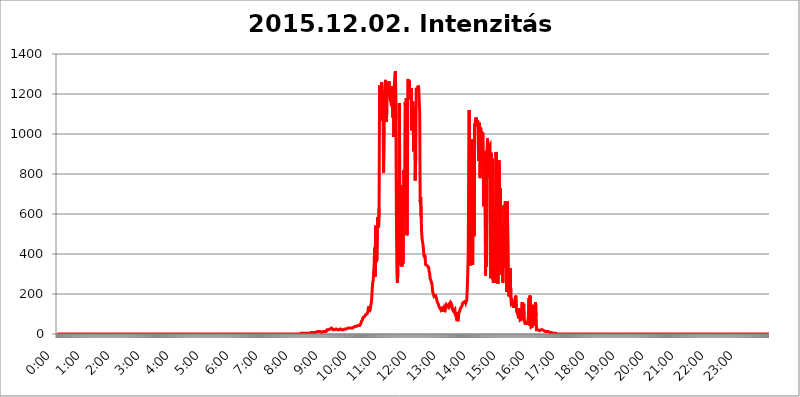
| Category | 2015.12.02. Intenzitás [W/m^2] |
|---|---|
| 0.0 | 0 |
| 0.0006944444444444445 | 0 |
| 0.001388888888888889 | 0 |
| 0.0020833333333333333 | 0 |
| 0.002777777777777778 | 0 |
| 0.003472222222222222 | 0 |
| 0.004166666666666667 | 0 |
| 0.004861111111111111 | 0 |
| 0.005555555555555556 | 0 |
| 0.0062499999999999995 | 0 |
| 0.006944444444444444 | 0 |
| 0.007638888888888889 | 0 |
| 0.008333333333333333 | 0 |
| 0.009027777777777779 | 0 |
| 0.009722222222222222 | 0 |
| 0.010416666666666666 | 0 |
| 0.011111111111111112 | 0 |
| 0.011805555555555555 | 0 |
| 0.012499999999999999 | 0 |
| 0.013194444444444444 | 0 |
| 0.013888888888888888 | 0 |
| 0.014583333333333332 | 0 |
| 0.015277777777777777 | 0 |
| 0.015972222222222224 | 0 |
| 0.016666666666666666 | 0 |
| 0.017361111111111112 | 0 |
| 0.018055555555555557 | 0 |
| 0.01875 | 0 |
| 0.019444444444444445 | 0 |
| 0.02013888888888889 | 0 |
| 0.020833333333333332 | 0 |
| 0.02152777777777778 | 0 |
| 0.022222222222222223 | 0 |
| 0.02291666666666667 | 0 |
| 0.02361111111111111 | 0 |
| 0.024305555555555556 | 0 |
| 0.024999999999999998 | 0 |
| 0.025694444444444447 | 0 |
| 0.02638888888888889 | 0 |
| 0.027083333333333334 | 0 |
| 0.027777777777777776 | 0 |
| 0.02847222222222222 | 0 |
| 0.029166666666666664 | 0 |
| 0.029861111111111113 | 0 |
| 0.030555555555555555 | 0 |
| 0.03125 | 0 |
| 0.03194444444444445 | 0 |
| 0.03263888888888889 | 0 |
| 0.03333333333333333 | 0 |
| 0.034027777777777775 | 0 |
| 0.034722222222222224 | 0 |
| 0.035416666666666666 | 0 |
| 0.036111111111111115 | 0 |
| 0.03680555555555556 | 0 |
| 0.0375 | 0 |
| 0.03819444444444444 | 0 |
| 0.03888888888888889 | 0 |
| 0.03958333333333333 | 0 |
| 0.04027777777777778 | 0 |
| 0.04097222222222222 | 0 |
| 0.041666666666666664 | 0 |
| 0.042361111111111106 | 0 |
| 0.04305555555555556 | 0 |
| 0.043750000000000004 | 0 |
| 0.044444444444444446 | 0 |
| 0.04513888888888889 | 0 |
| 0.04583333333333334 | 0 |
| 0.04652777777777778 | 0 |
| 0.04722222222222222 | 0 |
| 0.04791666666666666 | 0 |
| 0.04861111111111111 | 0 |
| 0.049305555555555554 | 0 |
| 0.049999999999999996 | 0 |
| 0.05069444444444445 | 0 |
| 0.051388888888888894 | 0 |
| 0.052083333333333336 | 0 |
| 0.05277777777777778 | 0 |
| 0.05347222222222222 | 0 |
| 0.05416666666666667 | 0 |
| 0.05486111111111111 | 0 |
| 0.05555555555555555 | 0 |
| 0.05625 | 0 |
| 0.05694444444444444 | 0 |
| 0.057638888888888885 | 0 |
| 0.05833333333333333 | 0 |
| 0.05902777777777778 | 0 |
| 0.059722222222222225 | 0 |
| 0.06041666666666667 | 0 |
| 0.061111111111111116 | 0 |
| 0.06180555555555556 | 0 |
| 0.0625 | 0 |
| 0.06319444444444444 | 0 |
| 0.06388888888888888 | 0 |
| 0.06458333333333334 | 0 |
| 0.06527777777777778 | 0 |
| 0.06597222222222222 | 0 |
| 0.06666666666666667 | 0 |
| 0.06736111111111111 | 0 |
| 0.06805555555555555 | 0 |
| 0.06874999999999999 | 0 |
| 0.06944444444444443 | 0 |
| 0.07013888888888889 | 0 |
| 0.07083333333333333 | 0 |
| 0.07152777777777779 | 0 |
| 0.07222222222222223 | 0 |
| 0.07291666666666667 | 0 |
| 0.07361111111111111 | 0 |
| 0.07430555555555556 | 0 |
| 0.075 | 0 |
| 0.07569444444444444 | 0 |
| 0.0763888888888889 | 0 |
| 0.07708333333333334 | 0 |
| 0.07777777777777778 | 0 |
| 0.07847222222222222 | 0 |
| 0.07916666666666666 | 0 |
| 0.0798611111111111 | 0 |
| 0.08055555555555556 | 0 |
| 0.08125 | 0 |
| 0.08194444444444444 | 0 |
| 0.08263888888888889 | 0 |
| 0.08333333333333333 | 0 |
| 0.08402777777777777 | 0 |
| 0.08472222222222221 | 0 |
| 0.08541666666666665 | 0 |
| 0.08611111111111112 | 0 |
| 0.08680555555555557 | 0 |
| 0.08750000000000001 | 0 |
| 0.08819444444444445 | 0 |
| 0.08888888888888889 | 0 |
| 0.08958333333333333 | 0 |
| 0.09027777777777778 | 0 |
| 0.09097222222222222 | 0 |
| 0.09166666666666667 | 0 |
| 0.09236111111111112 | 0 |
| 0.09305555555555556 | 0 |
| 0.09375 | 0 |
| 0.09444444444444444 | 0 |
| 0.09513888888888888 | 0 |
| 0.09583333333333333 | 0 |
| 0.09652777777777777 | 0 |
| 0.09722222222222222 | 0 |
| 0.09791666666666667 | 0 |
| 0.09861111111111111 | 0 |
| 0.09930555555555555 | 0 |
| 0.09999999999999999 | 0 |
| 0.10069444444444443 | 0 |
| 0.1013888888888889 | 0 |
| 0.10208333333333335 | 0 |
| 0.10277777777777779 | 0 |
| 0.10347222222222223 | 0 |
| 0.10416666666666667 | 0 |
| 0.10486111111111111 | 0 |
| 0.10555555555555556 | 0 |
| 0.10625 | 0 |
| 0.10694444444444444 | 0 |
| 0.1076388888888889 | 0 |
| 0.10833333333333334 | 0 |
| 0.10902777777777778 | 0 |
| 0.10972222222222222 | 0 |
| 0.1111111111111111 | 0 |
| 0.11180555555555556 | 0 |
| 0.11180555555555556 | 0 |
| 0.1125 | 0 |
| 0.11319444444444444 | 0 |
| 0.11388888888888889 | 0 |
| 0.11458333333333333 | 0 |
| 0.11527777777777777 | 0 |
| 0.11597222222222221 | 0 |
| 0.11666666666666665 | 0 |
| 0.1173611111111111 | 0 |
| 0.11805555555555557 | 0 |
| 0.11944444444444445 | 0 |
| 0.12013888888888889 | 0 |
| 0.12083333333333333 | 0 |
| 0.12152777777777778 | 0 |
| 0.12222222222222223 | 0 |
| 0.12291666666666667 | 0 |
| 0.12291666666666667 | 0 |
| 0.12361111111111112 | 0 |
| 0.12430555555555556 | 0 |
| 0.125 | 0 |
| 0.12569444444444444 | 0 |
| 0.12638888888888888 | 0 |
| 0.12708333333333333 | 0 |
| 0.16875 | 0 |
| 0.12847222222222224 | 0 |
| 0.12916666666666668 | 0 |
| 0.12986111111111112 | 0 |
| 0.13055555555555556 | 0 |
| 0.13125 | 0 |
| 0.13194444444444445 | 0 |
| 0.1326388888888889 | 0 |
| 0.13333333333333333 | 0 |
| 0.13402777777777777 | 0 |
| 0.13402777777777777 | 0 |
| 0.13472222222222222 | 0 |
| 0.13541666666666666 | 0 |
| 0.1361111111111111 | 0 |
| 0.13749999999999998 | 0 |
| 0.13819444444444443 | 0 |
| 0.1388888888888889 | 0 |
| 0.13958333333333334 | 0 |
| 0.14027777777777778 | 0 |
| 0.14097222222222222 | 0 |
| 0.14166666666666666 | 0 |
| 0.1423611111111111 | 0 |
| 0.14305555555555557 | 0 |
| 0.14375000000000002 | 0 |
| 0.14444444444444446 | 0 |
| 0.1451388888888889 | 0 |
| 0.1451388888888889 | 0 |
| 0.14652777777777778 | 0 |
| 0.14722222222222223 | 0 |
| 0.14791666666666667 | 0 |
| 0.1486111111111111 | 0 |
| 0.14930555555555555 | 0 |
| 0.15 | 0 |
| 0.15069444444444444 | 0 |
| 0.15138888888888888 | 0 |
| 0.15208333333333332 | 0 |
| 0.15277777777777776 | 0 |
| 0.15347222222222223 | 0 |
| 0.15416666666666667 | 0 |
| 0.15486111111111112 | 0 |
| 0.15555555555555556 | 0 |
| 0.15625 | 0 |
| 0.15694444444444444 | 0 |
| 0.15763888888888888 | 0 |
| 0.15833333333333333 | 0 |
| 0.15902777777777777 | 0 |
| 0.15972222222222224 | 0 |
| 0.16041666666666668 | 0 |
| 0.16111111111111112 | 0 |
| 0.16180555555555556 | 0 |
| 0.1625 | 0 |
| 0.16319444444444445 | 0 |
| 0.1638888888888889 | 0 |
| 0.16458333333333333 | 0 |
| 0.16527777777777777 | 0 |
| 0.16597222222222222 | 0 |
| 0.16666666666666666 | 0 |
| 0.1673611111111111 | 0 |
| 0.16805555555555554 | 0 |
| 0.16874999999999998 | 0 |
| 0.16944444444444443 | 0 |
| 0.17013888888888887 | 0 |
| 0.1708333333333333 | 0 |
| 0.17152777777777775 | 0 |
| 0.17222222222222225 | 0 |
| 0.1729166666666667 | 0 |
| 0.17361111111111113 | 0 |
| 0.17430555555555557 | 0 |
| 0.17500000000000002 | 0 |
| 0.17569444444444446 | 0 |
| 0.1763888888888889 | 0 |
| 0.17708333333333334 | 0 |
| 0.17777777777777778 | 0 |
| 0.17847222222222223 | 0 |
| 0.17916666666666667 | 0 |
| 0.1798611111111111 | 0 |
| 0.18055555555555555 | 0 |
| 0.18125 | 0 |
| 0.18194444444444444 | 0 |
| 0.1826388888888889 | 0 |
| 0.18333333333333335 | 0 |
| 0.1840277777777778 | 0 |
| 0.18472222222222223 | 0 |
| 0.18541666666666667 | 0 |
| 0.18611111111111112 | 0 |
| 0.18680555555555556 | 0 |
| 0.1875 | 0 |
| 0.18819444444444444 | 0 |
| 0.18888888888888888 | 0 |
| 0.18958333333333333 | 0 |
| 0.19027777777777777 | 0 |
| 0.1909722222222222 | 0 |
| 0.19166666666666665 | 0 |
| 0.19236111111111112 | 0 |
| 0.19305555555555554 | 0 |
| 0.19375 | 0 |
| 0.19444444444444445 | 0 |
| 0.1951388888888889 | 0 |
| 0.19583333333333333 | 0 |
| 0.19652777777777777 | 0 |
| 0.19722222222222222 | 0 |
| 0.19791666666666666 | 0 |
| 0.1986111111111111 | 0 |
| 0.19930555555555554 | 0 |
| 0.19999999999999998 | 0 |
| 0.20069444444444443 | 0 |
| 0.20138888888888887 | 0 |
| 0.2020833333333333 | 0 |
| 0.2027777777777778 | 0 |
| 0.2034722222222222 | 0 |
| 0.2041666666666667 | 0 |
| 0.20486111111111113 | 0 |
| 0.20555555555555557 | 0 |
| 0.20625000000000002 | 0 |
| 0.20694444444444446 | 0 |
| 0.2076388888888889 | 0 |
| 0.20833333333333334 | 0 |
| 0.20902777777777778 | 0 |
| 0.20972222222222223 | 0 |
| 0.21041666666666667 | 0 |
| 0.2111111111111111 | 0 |
| 0.21180555555555555 | 0 |
| 0.2125 | 0 |
| 0.21319444444444444 | 0 |
| 0.2138888888888889 | 0 |
| 0.21458333333333335 | 0 |
| 0.2152777777777778 | 0 |
| 0.21597222222222223 | 0 |
| 0.21666666666666667 | 0 |
| 0.21736111111111112 | 0 |
| 0.21805555555555556 | 0 |
| 0.21875 | 0 |
| 0.21944444444444444 | 0 |
| 0.22013888888888888 | 0 |
| 0.22083333333333333 | 0 |
| 0.22152777777777777 | 0 |
| 0.2222222222222222 | 0 |
| 0.22291666666666665 | 0 |
| 0.2236111111111111 | 0 |
| 0.22430555555555556 | 0 |
| 0.225 | 0 |
| 0.22569444444444445 | 0 |
| 0.2263888888888889 | 0 |
| 0.22708333333333333 | 0 |
| 0.22777777777777777 | 0 |
| 0.22847222222222222 | 0 |
| 0.22916666666666666 | 0 |
| 0.2298611111111111 | 0 |
| 0.23055555555555554 | 0 |
| 0.23124999999999998 | 0 |
| 0.23194444444444443 | 0 |
| 0.23263888888888887 | 0 |
| 0.2333333333333333 | 0 |
| 0.2340277777777778 | 0 |
| 0.2347222222222222 | 0 |
| 0.2354166666666667 | 0 |
| 0.23611111111111113 | 0 |
| 0.23680555555555557 | 0 |
| 0.23750000000000002 | 0 |
| 0.23819444444444446 | 0 |
| 0.2388888888888889 | 0 |
| 0.23958333333333334 | 0 |
| 0.24027777777777778 | 0 |
| 0.24097222222222223 | 0 |
| 0.24166666666666667 | 0 |
| 0.2423611111111111 | 0 |
| 0.24305555555555555 | 0 |
| 0.24375 | 0 |
| 0.24444444444444446 | 0 |
| 0.24513888888888888 | 0 |
| 0.24583333333333335 | 0 |
| 0.2465277777777778 | 0 |
| 0.24722222222222223 | 0 |
| 0.24791666666666667 | 0 |
| 0.24861111111111112 | 0 |
| 0.24930555555555556 | 0 |
| 0.25 | 0 |
| 0.25069444444444444 | 0 |
| 0.2513888888888889 | 0 |
| 0.2520833333333333 | 0 |
| 0.25277777777777777 | 0 |
| 0.2534722222222222 | 0 |
| 0.25416666666666665 | 0 |
| 0.2548611111111111 | 0 |
| 0.2555555555555556 | 0 |
| 0.25625000000000003 | 0 |
| 0.2569444444444445 | 0 |
| 0.2576388888888889 | 0 |
| 0.25833333333333336 | 0 |
| 0.2590277777777778 | 0 |
| 0.25972222222222224 | 0 |
| 0.2604166666666667 | 0 |
| 0.2611111111111111 | 0 |
| 0.26180555555555557 | 0 |
| 0.2625 | 0 |
| 0.26319444444444445 | 0 |
| 0.2638888888888889 | 0 |
| 0.26458333333333334 | 0 |
| 0.2652777777777778 | 0 |
| 0.2659722222222222 | 0 |
| 0.26666666666666666 | 0 |
| 0.2673611111111111 | 0 |
| 0.26805555555555555 | 0 |
| 0.26875 | 0 |
| 0.26944444444444443 | 0 |
| 0.2701388888888889 | 0 |
| 0.2708333333333333 | 0 |
| 0.27152777777777776 | 0 |
| 0.2722222222222222 | 0 |
| 0.27291666666666664 | 0 |
| 0.2736111111111111 | 0 |
| 0.2743055555555555 | 0 |
| 0.27499999999999997 | 0 |
| 0.27569444444444446 | 0 |
| 0.27638888888888885 | 0 |
| 0.27708333333333335 | 0 |
| 0.2777777777777778 | 0 |
| 0.27847222222222223 | 0 |
| 0.2791666666666667 | 0 |
| 0.2798611111111111 | 0 |
| 0.28055555555555556 | 0 |
| 0.28125 | 0 |
| 0.28194444444444444 | 0 |
| 0.2826388888888889 | 0 |
| 0.2833333333333333 | 0 |
| 0.28402777777777777 | 0 |
| 0.2847222222222222 | 0 |
| 0.28541666666666665 | 0 |
| 0.28611111111111115 | 0 |
| 0.28680555555555554 | 0 |
| 0.28750000000000003 | 0 |
| 0.2881944444444445 | 0 |
| 0.2888888888888889 | 0 |
| 0.28958333333333336 | 0 |
| 0.2902777777777778 | 0 |
| 0.29097222222222224 | 0 |
| 0.2916666666666667 | 0 |
| 0.2923611111111111 | 0 |
| 0.29305555555555557 | 0 |
| 0.29375 | 0 |
| 0.29444444444444445 | 0 |
| 0.2951388888888889 | 0 |
| 0.29583333333333334 | 0 |
| 0.2965277777777778 | 0 |
| 0.2972222222222222 | 0 |
| 0.29791666666666666 | 0 |
| 0.2986111111111111 | 0 |
| 0.29930555555555555 | 0 |
| 0.3 | 0 |
| 0.30069444444444443 | 0 |
| 0.3013888888888889 | 0 |
| 0.3020833333333333 | 0 |
| 0.30277777777777776 | 0 |
| 0.3034722222222222 | 0 |
| 0.30416666666666664 | 0 |
| 0.3048611111111111 | 0 |
| 0.3055555555555555 | 0 |
| 0.30624999999999997 | 0 |
| 0.3069444444444444 | 0 |
| 0.3076388888888889 | 0 |
| 0.30833333333333335 | 0 |
| 0.3090277777777778 | 0 |
| 0.30972222222222223 | 0 |
| 0.3104166666666667 | 0 |
| 0.3111111111111111 | 0 |
| 0.31180555555555556 | 0 |
| 0.3125 | 0 |
| 0.31319444444444444 | 0 |
| 0.3138888888888889 | 0 |
| 0.3145833333333333 | 0 |
| 0.31527777777777777 | 0 |
| 0.3159722222222222 | 0 |
| 0.31666666666666665 | 0 |
| 0.31736111111111115 | 0 |
| 0.31805555555555554 | 0 |
| 0.31875000000000003 | 0 |
| 0.3194444444444445 | 0 |
| 0.3201388888888889 | 0 |
| 0.32083333333333336 | 0 |
| 0.3215277777777778 | 0 |
| 0.32222222222222224 | 0 |
| 0.3229166666666667 | 0 |
| 0.3236111111111111 | 0 |
| 0.32430555555555557 | 0 |
| 0.325 | 0 |
| 0.32569444444444445 | 0 |
| 0.3263888888888889 | 0 |
| 0.32708333333333334 | 0 |
| 0.3277777777777778 | 0 |
| 0.3284722222222222 | 0 |
| 0.32916666666666666 | 0 |
| 0.3298611111111111 | 0 |
| 0.33055555555555555 | 0 |
| 0.33125 | 0 |
| 0.33194444444444443 | 0 |
| 0.3326388888888889 | 0 |
| 0.3333333333333333 | 0 |
| 0.3340277777777778 | 0 |
| 0.3347222222222222 | 0 |
| 0.3354166666666667 | 0 |
| 0.3361111111111111 | 0 |
| 0.3368055555555556 | 0 |
| 0.33749999999999997 | 0 |
| 0.33819444444444446 | 0 |
| 0.33888888888888885 | 0 |
| 0.33958333333333335 | 0 |
| 0.34027777777777773 | 3.525 |
| 0.34097222222222223 | 0 |
| 0.3416666666666666 | 3.525 |
| 0.3423611111111111 | 0 |
| 0.3430555555555555 | 0 |
| 0.34375 | 3.525 |
| 0.3444444444444445 | 3.525 |
| 0.3451388888888889 | 3.525 |
| 0.3458333333333334 | 3.525 |
| 0.34652777777777777 | 3.525 |
| 0.34722222222222227 | 3.525 |
| 0.34791666666666665 | 3.525 |
| 0.34861111111111115 | 3.525 |
| 0.34930555555555554 | 3.525 |
| 0.35000000000000003 | 3.525 |
| 0.3506944444444444 | 3.525 |
| 0.3513888888888889 | 3.525 |
| 0.3520833333333333 | 3.525 |
| 0.3527777777777778 | 3.525 |
| 0.3534722222222222 | 3.525 |
| 0.3541666666666667 | 3.525 |
| 0.3548611111111111 | 3.525 |
| 0.35555555555555557 | 7.887 |
| 0.35625 | 7.887 |
| 0.35694444444444445 | 7.887 |
| 0.3576388888888889 | 7.887 |
| 0.35833333333333334 | 7.887 |
| 0.3590277777777778 | 7.887 |
| 0.3597222222222222 | 7.887 |
| 0.36041666666666666 | 7.887 |
| 0.3611111111111111 | 7.887 |
| 0.36180555555555555 | 7.887 |
| 0.3625 | 7.887 |
| 0.36319444444444443 | 7.887 |
| 0.3638888888888889 | 7.887 |
| 0.3645833333333333 | 12.257 |
| 0.3652777777777778 | 12.257 |
| 0.3659722222222222 | 12.257 |
| 0.3666666666666667 | 12.257 |
| 0.3673611111111111 | 12.257 |
| 0.3680555555555556 | 12.257 |
| 0.36874999999999997 | 12.257 |
| 0.36944444444444446 | 12.257 |
| 0.37013888888888885 | 12.257 |
| 0.37083333333333335 | 7.887 |
| 0.37152777777777773 | 12.257 |
| 0.37222222222222223 | 12.257 |
| 0.3729166666666666 | 12.257 |
| 0.3736111111111111 | 12.257 |
| 0.3743055555555555 | 12.257 |
| 0.375 | 12.257 |
| 0.3756944444444445 | 12.257 |
| 0.3763888888888889 | 12.257 |
| 0.3770833333333334 | 12.257 |
| 0.37777777777777777 | 16.636 |
| 0.37847222222222227 | 21.024 |
| 0.37916666666666665 | 21.024 |
| 0.37986111111111115 | 21.024 |
| 0.38055555555555554 | 21.024 |
| 0.38125000000000003 | 21.024 |
| 0.3819444444444444 | 21.024 |
| 0.3826388888888889 | 25.419 |
| 0.3833333333333333 | 25.419 |
| 0.3840277777777778 | 29.823 |
| 0.3847222222222222 | 29.823 |
| 0.3854166666666667 | 25.419 |
| 0.3861111111111111 | 25.419 |
| 0.38680555555555557 | 21.024 |
| 0.3875 | 21.024 |
| 0.38819444444444445 | 21.024 |
| 0.3888888888888889 | 21.024 |
| 0.38958333333333334 | 25.419 |
| 0.3902777777777778 | 25.419 |
| 0.3909722222222222 | 25.419 |
| 0.39166666666666666 | 21.024 |
| 0.3923611111111111 | 21.024 |
| 0.39305555555555555 | 21.024 |
| 0.39375 | 21.024 |
| 0.39444444444444443 | 21.024 |
| 0.3951388888888889 | 21.024 |
| 0.3958333333333333 | 25.419 |
| 0.3965277777777778 | 25.419 |
| 0.3972222222222222 | 25.419 |
| 0.3979166666666667 | 25.419 |
| 0.3986111111111111 | 21.024 |
| 0.3993055555555556 | 21.024 |
| 0.39999999999999997 | 21.024 |
| 0.40069444444444446 | 21.024 |
| 0.40138888888888885 | 21.024 |
| 0.40208333333333335 | 25.419 |
| 0.40277777777777773 | 25.419 |
| 0.40347222222222223 | 25.419 |
| 0.4041666666666666 | 25.419 |
| 0.4048611111111111 | 21.024 |
| 0.4055555555555555 | 25.419 |
| 0.40625 | 29.823 |
| 0.4069444444444445 | 29.823 |
| 0.4076388888888889 | 29.823 |
| 0.4083333333333334 | 29.823 |
| 0.40902777777777777 | 29.823 |
| 0.40972222222222227 | 29.823 |
| 0.41041666666666665 | 29.823 |
| 0.41111111111111115 | 29.823 |
| 0.41180555555555554 | 29.823 |
| 0.41250000000000003 | 29.823 |
| 0.4131944444444444 | 29.823 |
| 0.4138888888888889 | 29.823 |
| 0.4145833333333333 | 29.823 |
| 0.4152777777777778 | 29.823 |
| 0.4159722222222222 | 34.234 |
| 0.4166666666666667 | 34.234 |
| 0.4173611111111111 | 38.653 |
| 0.41805555555555557 | 38.653 |
| 0.41875 | 43.079 |
| 0.41944444444444445 | 38.653 |
| 0.4201388888888889 | 38.653 |
| 0.42083333333333334 | 43.079 |
| 0.4215277777777778 | 43.079 |
| 0.4222222222222222 | 43.079 |
| 0.42291666666666666 | 43.079 |
| 0.4236111111111111 | 43.079 |
| 0.42430555555555555 | 43.079 |
| 0.425 | 47.511 |
| 0.42569444444444443 | 51.951 |
| 0.4263888888888889 | 60.85 |
| 0.4270833333333333 | 65.31 |
| 0.4277777777777778 | 69.775 |
| 0.4284722222222222 | 74.246 |
| 0.4291666666666667 | 83.205 |
| 0.4298611111111111 | 83.205 |
| 0.4305555555555556 | 83.205 |
| 0.43124999999999997 | 87.692 |
| 0.43194444444444446 | 92.184 |
| 0.43263888888888885 | 96.682 |
| 0.43333333333333335 | 96.682 |
| 0.43402777777777773 | 101.184 |
| 0.43472222222222223 | 101.184 |
| 0.4354166666666666 | 110.201 |
| 0.4361111111111111 | 114.716 |
| 0.4368055555555555 | 137.347 |
| 0.4375 | 110.201 |
| 0.4381944444444445 | 114.716 |
| 0.4388888888888889 | 123.758 |
| 0.4395833333333334 | 141.884 |
| 0.44027777777777777 | 150.964 |
| 0.44097222222222227 | 173.709 |
| 0.44166666666666665 | 219.309 |
| 0.44236111111111115 | 255.813 |
| 0.44305555555555554 | 264.932 |
| 0.44375000000000003 | 305.898 |
| 0.4444444444444444 | 346.682 |
| 0.4451388888888889 | 431.833 |
| 0.4458333333333333 | 287.709 |
| 0.4465277777777778 | 541.121 |
| 0.4472222222222222 | 360.221 |
| 0.4479166666666667 | 360.221 |
| 0.4486111111111111 | 373.729 |
| 0.44930555555555557 | 583.779 |
| 0.45 | 571.049 |
| 0.45069444444444445 | 532.513 |
| 0.4513888888888889 | 625.784 |
| 0.45208333333333334 | 1242.089 |
| 0.4527777777777778 | 1135.543 |
| 0.4534722222222222 | 1101.226 |
| 0.45416666666666666 | 1067.267 |
| 0.4548611111111111 | 1258.511 |
| 0.45555555555555555 | 1139.384 |
| 0.45625 | 1217.812 |
| 0.45694444444444443 | 1124.056 |
| 0.4576388888888889 | 806.757 |
| 0.4583333333333333 | 1033.537 |
| 0.4590277777777778 | 1124.056 |
| 0.4597222222222222 | 1250.275 |
| 0.4604166666666667 | 1270.964 |
| 0.4611111111111111 | 1238.014 |
| 0.4618055555555556 | 1059.756 |
| 0.46249999999999997 | 1221.83 |
| 0.46319444444444446 | 1250.275 |
| 0.46388888888888885 | 1258.511 |
| 0.46458333333333335 | 1238.014 |
| 0.46527777777777773 | 1262.649 |
| 0.46597222222222223 | 1205.82 |
| 0.4666666666666666 | 1201.843 |
| 0.4673611111111111 | 1162.571 |
| 0.4680555555555555 | 1189.969 |
| 0.46875 | 1139.384 |
| 0.4694444444444445 | 1147.086 |
| 0.4701388888888889 | 1238.014 |
| 0.4708333333333334 | 1082.324 |
| 0.47152777777777777 | 1193.918 |
| 0.47222222222222227 | 984.98 |
| 0.47291666666666665 | 1254.387 |
| 0.47361111111111115 | 1296.248 |
| 0.47430555555555554 | 1313.406 |
| 0.47500000000000003 | 1078.555 |
| 0.4756944444444444 | 566.793 |
| 0.4763888888888889 | 314.98 |
| 0.4770833333333333 | 255.813 |
| 0.4777777777777778 | 319.517 |
| 0.4784722222222222 | 763.674 |
| 0.4791666666666667 | 510.885 |
| 0.4798611111111111 | 1154.814 |
| 0.48055555555555557 | 467.187 |
| 0.48125 | 387.202 |
| 0.48194444444444445 | 342.162 |
| 0.4826388888888889 | 743.859 |
| 0.48333333333333334 | 337.639 |
| 0.4840277777777778 | 467.187 |
| 0.4847222222222222 | 351.198 |
| 0.48541666666666666 | 405.108 |
| 0.4861111111111111 | 818.392 |
| 0.48680555555555555 | 818.392 |
| 0.4875 | 604.864 |
| 0.48819444444444443 | 1158.689 |
| 0.4888888888888889 | 1018.587 |
| 0.4895833333333333 | 1178.177 |
| 0.4902777777777778 | 493.475 |
| 0.4909722222222222 | 506.542 |
| 0.4916666666666667 | 1258.511 |
| 0.4923611111111111 | 1275.142 |
| 0.4930555555555556 | 1201.843 |
| 0.49374999999999997 | 1266.8 |
| 0.49444444444444446 | 1174.263 |
| 0.49513888888888885 | 1209.807 |
| 0.49583333333333335 | 1217.812 |
| 0.49652777777777773 | 1229.899 |
| 0.49722222222222223 | 1018.587 |
| 0.4979166666666666 | 1093.653 |
| 0.4986111111111111 | 1162.571 |
| 0.4993055555555555 | 1162.571 |
| 0.5 | 913.766 |
| 0.5006944444444444 | 1135.543 |
| 0.5013888888888889 | 981.244 |
| 0.5020833333333333 | 767.62 |
| 0.5027777777777778 | 891.099 |
| 0.5034722222222222 | 1225.859 |
| 0.5041666666666667 | 1221.83 |
| 0.5048611111111111 | 1225.859 |
| 0.5055555555555555 | 1229.899 |
| 0.50625 | 1242.089 |
| 0.5069444444444444 | 1229.899 |
| 0.5076388888888889 | 1233.951 |
| 0.5083333333333333 | 1108.816 |
| 0.5090277777777777 | 658.909 |
| 0.5097222222222222 | 683.473 |
| 0.5104166666666666 | 579.542 |
| 0.5111111111111112 | 506.542 |
| 0.5118055555555555 | 471.582 |
| 0.5125000000000001 | 458.38 |
| 0.5131944444444444 | 440.702 |
| 0.513888888888889 | 409.574 |
| 0.5145833333333333 | 387.202 |
| 0.5152777777777778 | 396.164 |
| 0.5159722222222222 | 378.224 |
| 0.5166666666666667 | 346.682 |
| 0.517361111111111 | 342.162 |
| 0.5180555555555556 | 346.682 |
| 0.5187499999999999 | 342.162 |
| 0.5194444444444445 | 346.682 |
| 0.5201388888888888 | 342.162 |
| 0.5208333333333334 | 333.113 |
| 0.5215277777777778 | 314.98 |
| 0.5222222222222223 | 305.898 |
| 0.5229166666666667 | 278.603 |
| 0.5236111111111111 | 274.047 |
| 0.5243055555555556 | 264.932 |
| 0.525 | 255.813 |
| 0.5256944444444445 | 246.689 |
| 0.5263888888888889 | 214.746 |
| 0.5270833333333333 | 205.62 |
| 0.5277777777777778 | 196.497 |
| 0.5284722222222222 | 187.378 |
| 0.5291666666666667 | 191.937 |
| 0.5298611111111111 | 191.937 |
| 0.5305555555555556 | 191.937 |
| 0.53125 | 191.937 |
| 0.5319444444444444 | 178.264 |
| 0.5326388888888889 | 164.605 |
| 0.5333333333333333 | 164.605 |
| 0.5340277777777778 | 164.605 |
| 0.5347222222222222 | 146.423 |
| 0.5354166666666667 | 137.347 |
| 0.5361111111111111 | 137.347 |
| 0.5368055555555555 | 128.284 |
| 0.5375 | 128.284 |
| 0.5381944444444444 | 119.235 |
| 0.5388888888888889 | 119.235 |
| 0.5395833333333333 | 123.758 |
| 0.5402777777777777 | 128.284 |
| 0.5409722222222222 | 137.347 |
| 0.5416666666666666 | 110.201 |
| 0.5423611111111112 | 119.235 |
| 0.5430555555555555 | 132.814 |
| 0.5437500000000001 | 128.284 |
| 0.5444444444444444 | 123.758 |
| 0.545138888888889 | 128.284 |
| 0.5458333333333333 | 146.423 |
| 0.5465277777777778 | 146.423 |
| 0.5472222222222222 | 141.884 |
| 0.5479166666666667 | 137.347 |
| 0.548611111111111 | 137.347 |
| 0.5493055555555556 | 146.423 |
| 0.5499999999999999 | 137.347 |
| 0.5506944444444445 | 137.347 |
| 0.5513888888888888 | 146.423 |
| 0.5520833333333334 | 155.509 |
| 0.5527777777777778 | 155.509 |
| 0.5534722222222223 | 146.423 |
| 0.5541666666666667 | 123.758 |
| 0.5548611111111111 | 119.235 |
| 0.5555555555555556 | 114.716 |
| 0.55625 | 110.201 |
| 0.5569444444444445 | 110.201 |
| 0.5576388888888889 | 123.758 |
| 0.5583333333333333 | 92.184 |
| 0.5590277777777778 | 110.201 |
| 0.5597222222222222 | 83.205 |
| 0.5604166666666667 | 69.775 |
| 0.5611111111111111 | 74.246 |
| 0.5618055555555556 | 74.246 |
| 0.5625 | 69.775 |
| 0.5631944444444444 | 105.69 |
| 0.5638888888888889 | 101.184 |
| 0.5645833333333333 | 114.716 |
| 0.5652777777777778 | 128.284 |
| 0.5659722222222222 | 132.814 |
| 0.5666666666666667 | 128.284 |
| 0.5673611111111111 | 137.347 |
| 0.5680555555555555 | 146.423 |
| 0.56875 | 155.509 |
| 0.5694444444444444 | 160.056 |
| 0.5701388888888889 | 160.056 |
| 0.5708333333333333 | 160.056 |
| 0.5715277777777777 | 150.964 |
| 0.5722222222222222 | 164.605 |
| 0.5729166666666666 | 155.509 |
| 0.5736111111111112 | 155.509 |
| 0.5743055555555555 | 169.156 |
| 0.5750000000000001 | 219.309 |
| 0.5756944444444444 | 296.808 |
| 0.576388888888889 | 405.108 |
| 0.5770833333333333 | 818.392 |
| 0.5777777777777778 | 1120.238 |
| 0.5784722222222222 | 409.574 |
| 0.5791666666666667 | 342.162 |
| 0.579861111111111 | 337.639 |
| 0.5805555555555556 | 515.223 |
| 0.5812499999999999 | 973.772 |
| 0.5819444444444445 | 400.638 |
| 0.5826388888888888 | 346.682 |
| 0.5833333333333334 | 947.58 |
| 0.5840277777777778 | 898.668 |
| 0.5847222222222223 | 489.108 |
| 0.5854166666666667 | 1052.255 |
| 0.5861111111111111 | 1037.277 |
| 0.5868055555555556 | 1074.789 |
| 0.5875 | 1082.324 |
| 0.5881944444444445 | 1078.555 |
| 0.5888888888888889 | 1048.508 |
| 0.5895833333333333 | 1067.267 |
| 0.5902777777777778 | 1041.019 |
| 0.5909722222222222 | 864.493 |
| 0.5916666666666667 | 1056.004 |
| 0.5923611111111111 | 1044.762 |
| 0.5930555555555556 | 779.42 |
| 0.59375 | 1033.537 |
| 0.5944444444444444 | 999.916 |
| 0.5951388888888889 | 1014.852 |
| 0.5958333333333333 | 872.114 |
| 0.5965277777777778 | 1007.383 |
| 0.5972222222222222 | 996.182 |
| 0.5979166666666667 | 638.256 |
| 0.5986111111111111 | 913.766 |
| 0.5993055555555555 | 802.868 |
| 0.6 | 902.447 |
| 0.6006944444444444 | 292.259 |
| 0.6013888888888889 | 747.834 |
| 0.6020833333333333 | 337.639 |
| 0.6027777777777777 | 921.298 |
| 0.6034722222222222 | 977.508 |
| 0.6041666666666666 | 783.342 |
| 0.6048611111111112 | 845.365 |
| 0.6055555555555555 | 940.082 |
| 0.6062500000000001 | 943.832 |
| 0.6069444444444444 | 947.58 |
| 0.607638888888889 | 278.603 |
| 0.6083333333333333 | 906.223 |
| 0.6090277777777778 | 879.719 |
| 0.6097222222222222 | 691.608 |
| 0.6104166666666667 | 875.918 |
| 0.611111111111111 | 269.49 |
| 0.6118055555555556 | 255.813 |
| 0.6124999999999999 | 592.233 |
| 0.6131944444444445 | 310.44 |
| 0.6138888888888888 | 287.709 |
| 0.6145833333333334 | 255.813 |
| 0.6152777777777778 | 909.996 |
| 0.6159722222222223 | 883.516 |
| 0.6166666666666667 | 883.516 |
| 0.6173611111111111 | 763.674 |
| 0.6180555555555556 | 251.251 |
| 0.61875 | 475.972 |
| 0.6194444444444445 | 868.305 |
| 0.6201388888888889 | 822.26 |
| 0.6208333333333333 | 382.715 |
| 0.6215277777777778 | 727.896 |
| 0.6222222222222222 | 319.517 |
| 0.6229166666666667 | 296.808 |
| 0.6236111111111111 | 528.2 |
| 0.6243055555555556 | 355.712 |
| 0.625 | 255.813 |
| 0.6256944444444444 | 480.356 |
| 0.6263888888888889 | 642.4 |
| 0.6270833333333333 | 549.704 |
| 0.6277777777777778 | 333.113 |
| 0.6284722222222222 | 663.019 |
| 0.6291666666666667 | 431.833 |
| 0.6298611111111111 | 575.299 |
| 0.6305555555555555 | 210.182 |
| 0.63125 | 663.019 |
| 0.6319444444444444 | 663.019 |
| 0.6326388888888889 | 228.436 |
| 0.6333333333333333 | 187.378 |
| 0.6340277777777777 | 182.82 |
| 0.6347222222222222 | 201.058 |
| 0.6354166666666666 | 328.584 |
| 0.6361111111111112 | 182.82 |
| 0.6368055555555555 | 155.509 |
| 0.6375000000000001 | 150.964 |
| 0.6381944444444444 | 164.605 |
| 0.638888888888889 | 150.964 |
| 0.6395833333333333 | 137.347 |
| 0.6402777777777778 | 141.884 |
| 0.6409722222222222 | 141.884 |
| 0.6416666666666667 | 137.347 |
| 0.642361111111111 | 132.814 |
| 0.6430555555555556 | 191.937 |
| 0.6437499999999999 | 137.347 |
| 0.6444444444444445 | 110.201 |
| 0.6451388888888888 | 110.201 |
| 0.6458333333333334 | 101.184 |
| 0.6465277777777778 | 87.692 |
| 0.6472222222222223 | 78.722 |
| 0.6479166666666667 | 74.246 |
| 0.6486111111111111 | 128.284 |
| 0.6493055555555556 | 69.775 |
| 0.65 | 74.246 |
| 0.6506944444444445 | 74.246 |
| 0.6513888888888889 | 74.246 |
| 0.6520833333333333 | 160.056 |
| 0.6527777777777778 | 74.246 |
| 0.6534722222222222 | 74.246 |
| 0.6541666666666667 | 150.964 |
| 0.6548611111111111 | 65.31 |
| 0.6555555555555556 | 60.85 |
| 0.65625 | 51.951 |
| 0.6569444444444444 | 56.398 |
| 0.6576388888888889 | 51.951 |
| 0.6583333333333333 | 51.951 |
| 0.6590277777777778 | 47.511 |
| 0.6597222222222222 | 60.85 |
| 0.6604166666666667 | 51.951 |
| 0.6611111111111111 | 51.951 |
| 0.6618055555555555 | 178.264 |
| 0.6625 | 43.079 |
| 0.6631944444444444 | 191.937 |
| 0.6638888888888889 | 123.758 |
| 0.6645833333333333 | 34.234 |
| 0.6652777777777777 | 34.234 |
| 0.6659722222222222 | 34.234 |
| 0.6666666666666666 | 38.653 |
| 0.6673611111111111 | 146.423 |
| 0.6680555555555556 | 47.511 |
| 0.6687500000000001 | 56.398 |
| 0.6694444444444444 | 56.398 |
| 0.6701388888888888 | 43.079 |
| 0.6708333333333334 | 160.056 |
| 0.6715277777777778 | 87.692 |
| 0.6722222222222222 | 21.024 |
| 0.6729166666666666 | 25.419 |
| 0.6736111111111112 | 21.024 |
| 0.6743055555555556 | 21.024 |
| 0.6749999999999999 | 21.024 |
| 0.6756944444444444 | 21.024 |
| 0.6763888888888889 | 16.636 |
| 0.6770833333333334 | 21.024 |
| 0.6777777777777777 | 21.024 |
| 0.6784722222222223 | 21.024 |
| 0.6791666666666667 | 21.024 |
| 0.6798611111111111 | 21.024 |
| 0.6805555555555555 | 21.024 |
| 0.68125 | 21.024 |
| 0.6819444444444445 | 16.636 |
| 0.6826388888888889 | 16.636 |
| 0.6833333333333332 | 16.636 |
| 0.6840277777777778 | 12.257 |
| 0.6847222222222222 | 12.257 |
| 0.6854166666666667 | 12.257 |
| 0.686111111111111 | 12.257 |
| 0.6868055555555556 | 12.257 |
| 0.6875 | 12.257 |
| 0.6881944444444444 | 12.257 |
| 0.688888888888889 | 12.257 |
| 0.6895833333333333 | 7.887 |
| 0.6902777777777778 | 7.887 |
| 0.6909722222222222 | 7.887 |
| 0.6916666666666668 | 7.887 |
| 0.6923611111111111 | 7.887 |
| 0.6930555555555555 | 7.887 |
| 0.69375 | 7.887 |
| 0.6944444444444445 | 7.887 |
| 0.6951388888888889 | 3.525 |
| 0.6958333333333333 | 3.525 |
| 0.6965277777777777 | 3.525 |
| 0.6972222222222223 | 3.525 |
| 0.6979166666666666 | 3.525 |
| 0.6986111111111111 | 3.525 |
| 0.6993055555555556 | 3.525 |
| 0.7000000000000001 | 3.525 |
| 0.7006944444444444 | 3.525 |
| 0.7013888888888888 | 0 |
| 0.7020833333333334 | 0 |
| 0.7027777777777778 | 0 |
| 0.7034722222222222 | 0 |
| 0.7041666666666666 | 0 |
| 0.7048611111111112 | 0 |
| 0.7055555555555556 | 0 |
| 0.7062499999999999 | 0 |
| 0.7069444444444444 | 0 |
| 0.7076388888888889 | 0 |
| 0.7083333333333334 | 0 |
| 0.7090277777777777 | 0 |
| 0.7097222222222223 | 0 |
| 0.7104166666666667 | 0 |
| 0.7111111111111111 | 0 |
| 0.7118055555555555 | 0 |
| 0.7125 | 0 |
| 0.7131944444444445 | 0 |
| 0.7138888888888889 | 0 |
| 0.7145833333333332 | 0 |
| 0.7152777777777778 | 0 |
| 0.7159722222222222 | 0 |
| 0.7166666666666667 | 0 |
| 0.717361111111111 | 0 |
| 0.7180555555555556 | 0 |
| 0.71875 | 0 |
| 0.7194444444444444 | 0 |
| 0.720138888888889 | 0 |
| 0.7208333333333333 | 0 |
| 0.7215277777777778 | 0 |
| 0.7222222222222222 | 0 |
| 0.7229166666666668 | 0 |
| 0.7236111111111111 | 0 |
| 0.7243055555555555 | 0 |
| 0.725 | 0 |
| 0.7256944444444445 | 0 |
| 0.7263888888888889 | 0 |
| 0.7270833333333333 | 0 |
| 0.7277777777777777 | 0 |
| 0.7284722222222223 | 0 |
| 0.7291666666666666 | 0 |
| 0.7298611111111111 | 0 |
| 0.7305555555555556 | 0 |
| 0.7312500000000001 | 0 |
| 0.7319444444444444 | 0 |
| 0.7326388888888888 | 0 |
| 0.7333333333333334 | 0 |
| 0.7340277777777778 | 0 |
| 0.7347222222222222 | 0 |
| 0.7354166666666666 | 0 |
| 0.7361111111111112 | 0 |
| 0.7368055555555556 | 0 |
| 0.7374999999999999 | 0 |
| 0.7381944444444444 | 0 |
| 0.7388888888888889 | 0 |
| 0.7395833333333334 | 0 |
| 0.7402777777777777 | 0 |
| 0.7409722222222223 | 0 |
| 0.7416666666666667 | 0 |
| 0.7423611111111111 | 0 |
| 0.7430555555555555 | 0 |
| 0.74375 | 0 |
| 0.7444444444444445 | 0 |
| 0.7451388888888889 | 0 |
| 0.7458333333333332 | 0 |
| 0.7465277777777778 | 0 |
| 0.7472222222222222 | 0 |
| 0.7479166666666667 | 0 |
| 0.748611111111111 | 0 |
| 0.7493055555555556 | 0 |
| 0.75 | 0 |
| 0.7506944444444444 | 0 |
| 0.751388888888889 | 0 |
| 0.7520833333333333 | 0 |
| 0.7527777777777778 | 0 |
| 0.7534722222222222 | 0 |
| 0.7541666666666668 | 0 |
| 0.7548611111111111 | 0 |
| 0.7555555555555555 | 0 |
| 0.75625 | 0 |
| 0.7569444444444445 | 0 |
| 0.7576388888888889 | 0 |
| 0.7583333333333333 | 0 |
| 0.7590277777777777 | 0 |
| 0.7597222222222223 | 0 |
| 0.7604166666666666 | 0 |
| 0.7611111111111111 | 0 |
| 0.7618055555555556 | 0 |
| 0.7625000000000001 | 0 |
| 0.7631944444444444 | 0 |
| 0.7638888888888888 | 0 |
| 0.7645833333333334 | 0 |
| 0.7652777777777778 | 0 |
| 0.7659722222222222 | 0 |
| 0.7666666666666666 | 0 |
| 0.7673611111111112 | 0 |
| 0.7680555555555556 | 0 |
| 0.7687499999999999 | 0 |
| 0.7694444444444444 | 0 |
| 0.7701388888888889 | 0 |
| 0.7708333333333334 | 0 |
| 0.7715277777777777 | 0 |
| 0.7722222222222223 | 0 |
| 0.7729166666666667 | 0 |
| 0.7736111111111111 | 0 |
| 0.7743055555555555 | 0 |
| 0.775 | 0 |
| 0.7756944444444445 | 0 |
| 0.7763888888888889 | 0 |
| 0.7770833333333332 | 0 |
| 0.7777777777777778 | 0 |
| 0.7784722222222222 | 0 |
| 0.7791666666666667 | 0 |
| 0.779861111111111 | 0 |
| 0.7805555555555556 | 0 |
| 0.78125 | 0 |
| 0.7819444444444444 | 0 |
| 0.782638888888889 | 0 |
| 0.7833333333333333 | 0 |
| 0.7840277777777778 | 0 |
| 0.7847222222222222 | 0 |
| 0.7854166666666668 | 0 |
| 0.7861111111111111 | 0 |
| 0.7868055555555555 | 0 |
| 0.7875 | 0 |
| 0.7881944444444445 | 0 |
| 0.7888888888888889 | 0 |
| 0.7895833333333333 | 0 |
| 0.7902777777777777 | 0 |
| 0.7909722222222223 | 0 |
| 0.7916666666666666 | 0 |
| 0.7923611111111111 | 0 |
| 0.7930555555555556 | 0 |
| 0.7937500000000001 | 0 |
| 0.7944444444444444 | 0 |
| 0.7951388888888888 | 0 |
| 0.7958333333333334 | 0 |
| 0.7965277777777778 | 0 |
| 0.7972222222222222 | 0 |
| 0.7979166666666666 | 0 |
| 0.7986111111111112 | 0 |
| 0.7993055555555556 | 0 |
| 0.7999999999999999 | 0 |
| 0.8006944444444444 | 0 |
| 0.8013888888888889 | 0 |
| 0.8020833333333334 | 0 |
| 0.8027777777777777 | 0 |
| 0.8034722222222223 | 0 |
| 0.8041666666666667 | 0 |
| 0.8048611111111111 | 0 |
| 0.8055555555555555 | 0 |
| 0.80625 | 0 |
| 0.8069444444444445 | 0 |
| 0.8076388888888889 | 0 |
| 0.8083333333333332 | 0 |
| 0.8090277777777778 | 0 |
| 0.8097222222222222 | 0 |
| 0.8104166666666667 | 0 |
| 0.811111111111111 | 0 |
| 0.8118055555555556 | 0 |
| 0.8125 | 0 |
| 0.8131944444444444 | 0 |
| 0.813888888888889 | 0 |
| 0.8145833333333333 | 0 |
| 0.8152777777777778 | 0 |
| 0.8159722222222222 | 0 |
| 0.8166666666666668 | 0 |
| 0.8173611111111111 | 0 |
| 0.8180555555555555 | 0 |
| 0.81875 | 0 |
| 0.8194444444444445 | 0 |
| 0.8201388888888889 | 0 |
| 0.8208333333333333 | 0 |
| 0.8215277777777777 | 0 |
| 0.8222222222222223 | 0 |
| 0.8229166666666666 | 0 |
| 0.8236111111111111 | 0 |
| 0.8243055555555556 | 0 |
| 0.8250000000000001 | 0 |
| 0.8256944444444444 | 0 |
| 0.8263888888888888 | 0 |
| 0.8270833333333334 | 0 |
| 0.8277777777777778 | 0 |
| 0.8284722222222222 | 0 |
| 0.8291666666666666 | 0 |
| 0.8298611111111112 | 0 |
| 0.8305555555555556 | 0 |
| 0.8312499999999999 | 0 |
| 0.8319444444444444 | 0 |
| 0.8326388888888889 | 0 |
| 0.8333333333333334 | 0 |
| 0.8340277777777777 | 0 |
| 0.8347222222222223 | 0 |
| 0.8354166666666667 | 0 |
| 0.8361111111111111 | 0 |
| 0.8368055555555555 | 0 |
| 0.8375 | 0 |
| 0.8381944444444445 | 0 |
| 0.8388888888888889 | 0 |
| 0.8395833333333332 | 0 |
| 0.8402777777777778 | 0 |
| 0.8409722222222222 | 0 |
| 0.8416666666666667 | 0 |
| 0.842361111111111 | 0 |
| 0.8430555555555556 | 0 |
| 0.84375 | 0 |
| 0.8444444444444444 | 0 |
| 0.845138888888889 | 0 |
| 0.8458333333333333 | 0 |
| 0.8465277777777778 | 0 |
| 0.8472222222222222 | 0 |
| 0.8479166666666668 | 0 |
| 0.8486111111111111 | 0 |
| 0.8493055555555555 | 0 |
| 0.85 | 0 |
| 0.8506944444444445 | 0 |
| 0.8513888888888889 | 0 |
| 0.8520833333333333 | 0 |
| 0.8527777777777777 | 0 |
| 0.8534722222222223 | 0 |
| 0.8541666666666666 | 0 |
| 0.8548611111111111 | 0 |
| 0.8555555555555556 | 0 |
| 0.8562500000000001 | 0 |
| 0.8569444444444444 | 0 |
| 0.8576388888888888 | 0 |
| 0.8583333333333334 | 0 |
| 0.8590277777777778 | 0 |
| 0.8597222222222222 | 0 |
| 0.8604166666666666 | 0 |
| 0.8611111111111112 | 0 |
| 0.8618055555555556 | 0 |
| 0.8624999999999999 | 0 |
| 0.8631944444444444 | 0 |
| 0.8638888888888889 | 0 |
| 0.8645833333333334 | 0 |
| 0.8652777777777777 | 0 |
| 0.8659722222222223 | 0 |
| 0.8666666666666667 | 0 |
| 0.8673611111111111 | 0 |
| 0.8680555555555555 | 0 |
| 0.86875 | 0 |
| 0.8694444444444445 | 0 |
| 0.8701388888888889 | 0 |
| 0.8708333333333332 | 0 |
| 0.8715277777777778 | 0 |
| 0.8722222222222222 | 0 |
| 0.8729166666666667 | 0 |
| 0.873611111111111 | 0 |
| 0.8743055555555556 | 0 |
| 0.875 | 0 |
| 0.8756944444444444 | 0 |
| 0.876388888888889 | 0 |
| 0.8770833333333333 | 0 |
| 0.8777777777777778 | 0 |
| 0.8784722222222222 | 0 |
| 0.8791666666666668 | 0 |
| 0.8798611111111111 | 0 |
| 0.8805555555555555 | 0 |
| 0.88125 | 0 |
| 0.8819444444444445 | 0 |
| 0.8826388888888889 | 0 |
| 0.8833333333333333 | 0 |
| 0.8840277777777777 | 0 |
| 0.8847222222222223 | 0 |
| 0.8854166666666666 | 0 |
| 0.8861111111111111 | 0 |
| 0.8868055555555556 | 0 |
| 0.8875000000000001 | 0 |
| 0.8881944444444444 | 0 |
| 0.8888888888888888 | 0 |
| 0.8895833333333334 | 0 |
| 0.8902777777777778 | 0 |
| 0.8909722222222222 | 0 |
| 0.8916666666666666 | 0 |
| 0.8923611111111112 | 0 |
| 0.8930555555555556 | 0 |
| 0.8937499999999999 | 0 |
| 0.8944444444444444 | 0 |
| 0.8951388888888889 | 0 |
| 0.8958333333333334 | 0 |
| 0.8965277777777777 | 0 |
| 0.8972222222222223 | 0 |
| 0.8979166666666667 | 0 |
| 0.8986111111111111 | 0 |
| 0.8993055555555555 | 0 |
| 0.9 | 0 |
| 0.9006944444444445 | 0 |
| 0.9013888888888889 | 0 |
| 0.9020833333333332 | 0 |
| 0.9027777777777778 | 0 |
| 0.9034722222222222 | 0 |
| 0.9041666666666667 | 0 |
| 0.904861111111111 | 0 |
| 0.9055555555555556 | 0 |
| 0.90625 | 0 |
| 0.9069444444444444 | 0 |
| 0.907638888888889 | 0 |
| 0.9083333333333333 | 0 |
| 0.9090277777777778 | 0 |
| 0.9097222222222222 | 0 |
| 0.9104166666666668 | 0 |
| 0.9111111111111111 | 0 |
| 0.9118055555555555 | 0 |
| 0.9125 | 0 |
| 0.9131944444444445 | 0 |
| 0.9138888888888889 | 0 |
| 0.9145833333333333 | 0 |
| 0.9152777777777777 | 0 |
| 0.9159722222222223 | 0 |
| 0.9166666666666666 | 0 |
| 0.9173611111111111 | 0 |
| 0.9180555555555556 | 0 |
| 0.9187500000000001 | 0 |
| 0.9194444444444444 | 0 |
| 0.9201388888888888 | 0 |
| 0.9208333333333334 | 0 |
| 0.9215277777777778 | 0 |
| 0.9222222222222222 | 0 |
| 0.9229166666666666 | 0 |
| 0.9236111111111112 | 0 |
| 0.9243055555555556 | 0 |
| 0.9249999999999999 | 0 |
| 0.9256944444444444 | 0 |
| 0.9263888888888889 | 0 |
| 0.9270833333333334 | 0 |
| 0.9277777777777777 | 0 |
| 0.9284722222222223 | 0 |
| 0.9291666666666667 | 0 |
| 0.9298611111111111 | 0 |
| 0.9305555555555555 | 0 |
| 0.93125 | 0 |
| 0.9319444444444445 | 0 |
| 0.9326388888888889 | 0 |
| 0.9333333333333332 | 0 |
| 0.9340277777777778 | 0 |
| 0.9347222222222222 | 0 |
| 0.9354166666666667 | 0 |
| 0.936111111111111 | 0 |
| 0.9368055555555556 | 0 |
| 0.9375 | 0 |
| 0.9381944444444444 | 0 |
| 0.938888888888889 | 0 |
| 0.9395833333333333 | 0 |
| 0.9402777777777778 | 0 |
| 0.9409722222222222 | 0 |
| 0.9416666666666668 | 0 |
| 0.9423611111111111 | 0 |
| 0.9430555555555555 | 0 |
| 0.94375 | 0 |
| 0.9444444444444445 | 0 |
| 0.9451388888888889 | 0 |
| 0.9458333333333333 | 0 |
| 0.9465277777777777 | 0 |
| 0.9472222222222223 | 0 |
| 0.9479166666666666 | 0 |
| 0.9486111111111111 | 0 |
| 0.9493055555555556 | 0 |
| 0.9500000000000001 | 0 |
| 0.9506944444444444 | 0 |
| 0.9513888888888888 | 0 |
| 0.9520833333333334 | 0 |
| 0.9527777777777778 | 0 |
| 0.9534722222222222 | 0 |
| 0.9541666666666666 | 0 |
| 0.9548611111111112 | 0 |
| 0.9555555555555556 | 0 |
| 0.9562499999999999 | 0 |
| 0.9569444444444444 | 0 |
| 0.9576388888888889 | 0 |
| 0.9583333333333334 | 0 |
| 0.9590277777777777 | 0 |
| 0.9597222222222223 | 0 |
| 0.9604166666666667 | 0 |
| 0.9611111111111111 | 0 |
| 0.9618055555555555 | 0 |
| 0.9625 | 0 |
| 0.9631944444444445 | 0 |
| 0.9638888888888889 | 0 |
| 0.9645833333333332 | 0 |
| 0.9652777777777778 | 0 |
| 0.9659722222222222 | 0 |
| 0.9666666666666667 | 0 |
| 0.967361111111111 | 0 |
| 0.9680555555555556 | 0 |
| 0.96875 | 0 |
| 0.9694444444444444 | 0 |
| 0.970138888888889 | 0 |
| 0.9708333333333333 | 0 |
| 0.9715277777777778 | 0 |
| 0.9722222222222222 | 0 |
| 0.9729166666666668 | 0 |
| 0.9736111111111111 | 0 |
| 0.9743055555555555 | 0 |
| 0.975 | 0 |
| 0.9756944444444445 | 0 |
| 0.9763888888888889 | 0 |
| 0.9770833333333333 | 0 |
| 0.9777777777777777 | 0 |
| 0.9784722222222223 | 0 |
| 0.9791666666666666 | 0 |
| 0.9798611111111111 | 0 |
| 0.9805555555555556 | 0 |
| 0.9812500000000001 | 0 |
| 0.9819444444444444 | 0 |
| 0.9826388888888888 | 0 |
| 0.9833333333333334 | 0 |
| 0.9840277777777778 | 0 |
| 0.9847222222222222 | 0 |
| 0.9854166666666666 | 0 |
| 0.9861111111111112 | 0 |
| 0.9868055555555556 | 0 |
| 0.9874999999999999 | 0 |
| 0.9881944444444444 | 0 |
| 0.9888888888888889 | 0 |
| 0.9895833333333334 | 0 |
| 0.9902777777777777 | 0 |
| 0.9909722222222223 | 0 |
| 0.9916666666666667 | 0 |
| 0.9923611111111111 | 0 |
| 0.9930555555555555 | 0 |
| 0.99375 | 0 |
| 0.9944444444444445 | 0 |
| 0.9951388888888889 | 0 |
| 0.9958333333333332 | 0 |
| 0.9965277777777778 | 0 |
| 0.9972222222222222 | 0 |
| 0.9979166666666667 | 0 |
| 0.998611111111111 | 0 |
| 0.9993055555555556 | 0 |